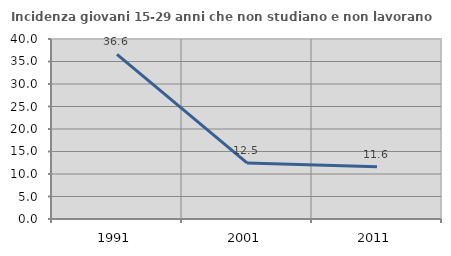
| Category | Incidenza giovani 15-29 anni che non studiano e non lavorano  |
|---|---|
| 1991.0 | 36.585 |
| 2001.0 | 12.454 |
| 2011.0 | 11.584 |